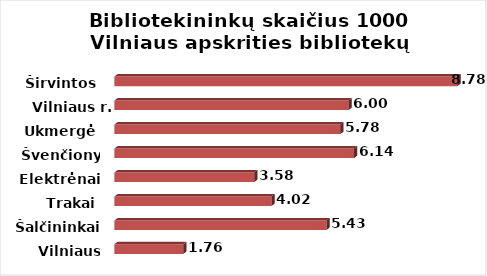
| Category | Series 0 |
|---|---|
| Vilniaus m. | 1.763 |
| Šalčininkai | 5.428 |
| Trakai | 4.022 |
| Elektrėnai | 3.582 |
| Švenčionys | 6.136 |
| Ukmergė | 5.784 |
| Vilniaus r. | 5.995 |
| Širvintos | 8.78 |